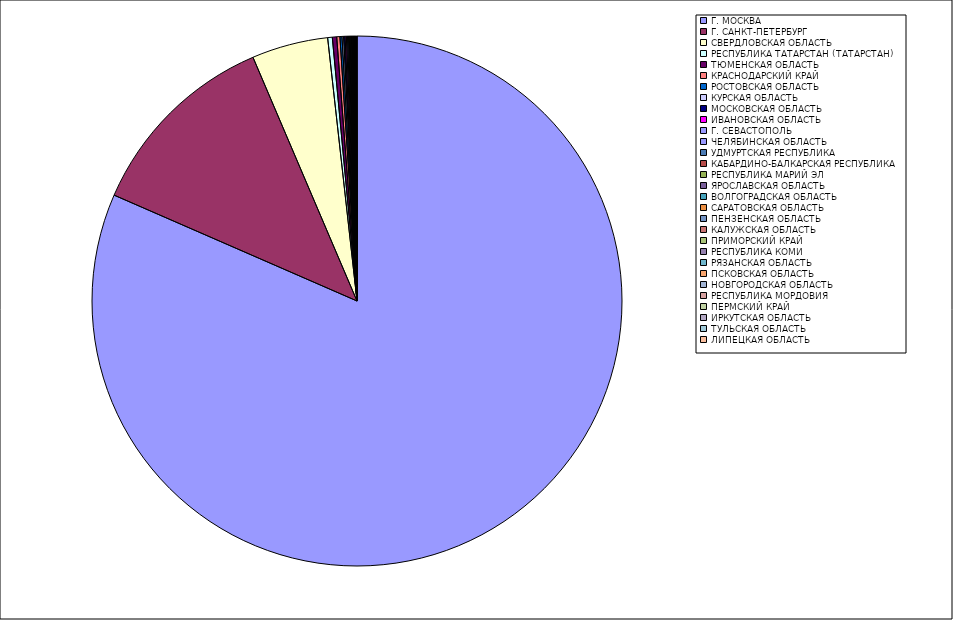
| Category | Оборот |
|---|---|
| Г. МОСКВА | 81.493 |
| Г. САНКТ-ПЕТЕРБУРГ | 12.031 |
| СВЕРДЛОВСКАЯ ОБЛАСТЬ | 4.649 |
| РЕСПУБЛИКА ТАТАРСТАН (ТАТАРСТАН) | 0.282 |
| ТЮМЕНСКАЯ ОБЛАСТЬ | 0.265 |
| КРАСНОДАРСКИЙ КРАЙ | 0.194 |
| РОСТОВСКАЯ ОБЛАСТЬ | 0.123 |
| КУРСКАЯ ОБЛАСТЬ | 0.098 |
| МОСКОВСКАЯ ОБЛАСТЬ | 0.089 |
| ИВАНОВСКАЯ ОБЛАСТЬ | 0.078 |
| Г. СЕВАСТОПОЛЬ | 0.067 |
| ЧЕЛЯБИНСКАЯ ОБЛАСТЬ | 0.062 |
| УДМУРТСКАЯ РЕСПУБЛИКА | 0.047 |
| КАБАРДИНО-БАЛКАРСКАЯ РЕСПУБЛИКА | 0.047 |
| РЕСПУБЛИКА МАРИЙ ЭЛ | 0.043 |
| ЯРОСЛАВСКАЯ ОБЛАСТЬ | 0.042 |
| ВОЛГОГРАДСКАЯ ОБЛАСТЬ | 0.039 |
| САРАТОВСКАЯ ОБЛАСТЬ | 0.035 |
| ПЕНЗЕНСКАЯ ОБЛАСТЬ | 0.033 |
| КАЛУЖСКАЯ ОБЛАСТЬ | 0.032 |
| ПРИМОРСКИЙ КРАЙ | 0.03 |
| РЕСПУБЛИКА КОМИ | 0.03 |
| РЯЗАНСКАЯ ОБЛАСТЬ | 0.023 |
| ПСКОВСКАЯ ОБЛАСТЬ | 0.023 |
| НОВГОРОДСКАЯ ОБЛАСТЬ | 0.021 |
| РЕСПУБЛИКА МОРДОВИЯ | 0.015 |
| ПЕРМСКИЙ КРАЙ | 0.014 |
| ИРКУТСКАЯ ОБЛАСТЬ | 0.013 |
| ТУЛЬСКАЯ ОБЛАСТЬ | 0.012 |
| ЛИПЕЦКАЯ ОБЛАСТЬ | 0.011 |